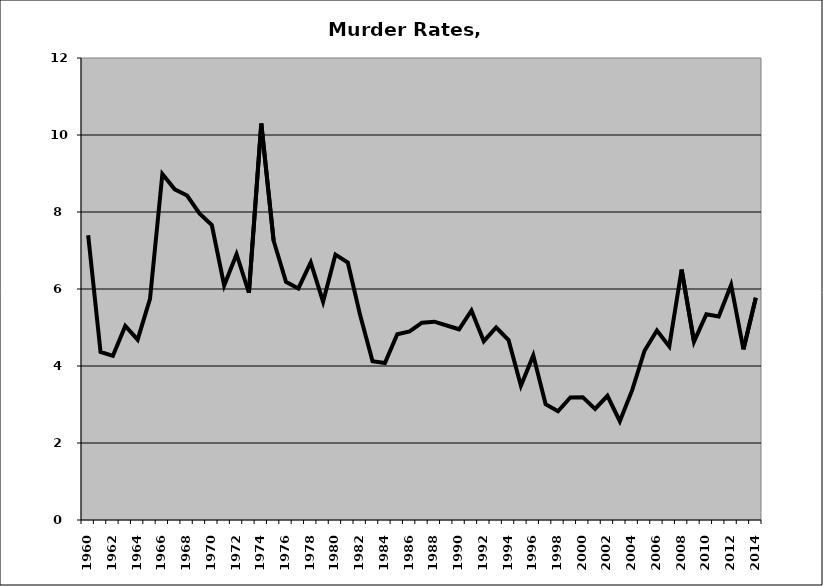
| Category | Murder |
|---|---|
| 1960.0 | 7.394 |
| 1961.0 | 4.367 |
| 1962.0 | 4.264 |
| 1963.0 | 5.042 |
| 1964.0 | 4.684 |
| 1965.0 | 5.743 |
| 1966.0 | 8.984 |
| 1967.0 | 8.588 |
| 1968.0 | 8.427 |
| 1969.0 | 7.963 |
| 1970.0 | 7.663 |
| 1971.0 | 6.093 |
| 1972.0 | 6.903 |
| 1973.0 | 5.903 |
| 1974.0 | 10.297 |
| 1975.0 | 7.254 |
| 1976.0 | 6.186 |
| 1977.0 | 6.014 |
| 1978.0 | 6.69 |
| 1979.0 | 5.67 |
| 1980.0 | 6.893 |
| 1981.0 | 6.689 |
| 1982.0 | 5.316 |
| 1983.0 | 4.125 |
| 1984.0 | 4.078 |
| 1985.0 | 4.823 |
| 1986.0 | 4.897 |
| 1987.0 | 5.124 |
| 1988.0 | 5.152 |
| 1989.0 | 5.052 |
| 1990.0 | 4.954 |
| 1991.0 | 5.441 |
| 1992.0 | 4.644 |
| 1993.0 | 5 |
| 1994.0 | 4.674 |
| 1995.0 | 3.487 |
| 1996.0 | 4.276 |
| 1997.0 | 3.005 |
| 1998.0 | 2.823 |
| 1999.0 | 3.185 |
| 2000.0 | 3.19 |
| 2001.0 | 2.887 |
| 2002.0 | 3.226 |
| 2003.0 | 2.567 |
| 2004.0 | 3.373 |
| 2005.0 | 4.396 |
| 2006.0 | 4.921 |
| 2007.0 | 4.51 |
| 2008.0 | 6.505 |
| 2009.0 | 4.632 |
| 2010.0 | 5.346 |
| 2011.0 | 5.286 |
| 2012.0 | 6.107 |
| 2013.0 | 4.431 |
| 2014.0 | 5.772 |